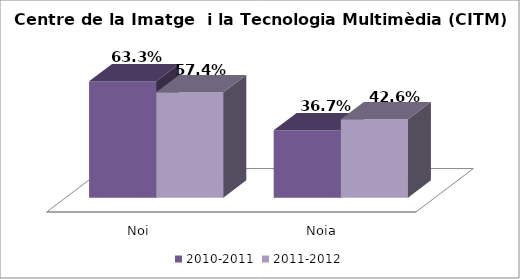
| Category | 2010-2011 | 2011-2012 |
|---|---|---|
| Noi | 0.633 | 0.574 |
| Noia | 0.367 | 0.426 |